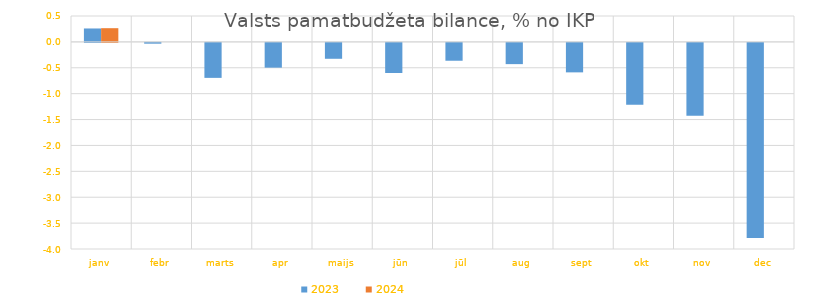
| Category | 2023 | 2024 |
|---|---|---|
| janv | 0.259 | 0.265 |
| febr | -0.015 | 0 |
| marts | -0.676 | 0 |
| apr | -0.478 | 0 |
| maijs | -0.307 | 0 |
| jūn | -0.582 | 0 |
| jūl | -0.345 | 0 |
| aug | -0.41 | 0 |
| sept | -0.569 | 0 |
| okt | -1.193 | 0 |
| nov | -1.408 | 0 |
| dec | -3.766 | 0 |